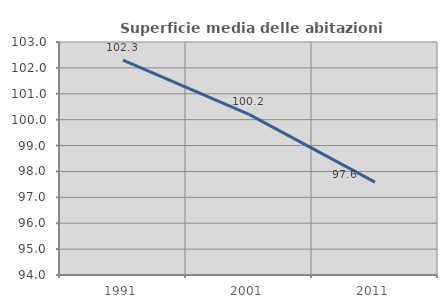
| Category | Superficie media delle abitazioni occupate |
|---|---|
| 1991.0 | 102.298 |
| 2001.0 | 100.204 |
| 2011.0 | 97.586 |